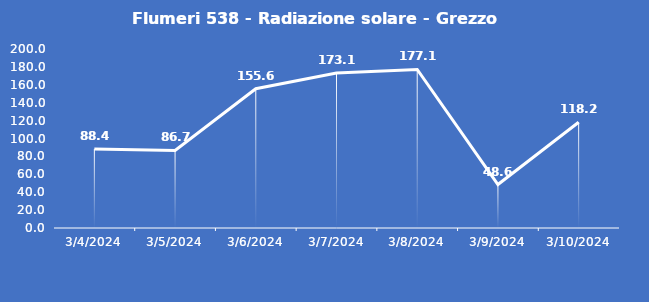
| Category | Flumeri 538 - Radiazione solare - Grezzo (W/m2) |
|---|---|
| 3/4/24 | 88.4 |
| 3/5/24 | 86.7 |
| 3/6/24 | 155.6 |
| 3/7/24 | 173.1 |
| 3/8/24 | 177.1 |
| 3/9/24 | 48.6 |
| 3/10/24 | 118.2 |